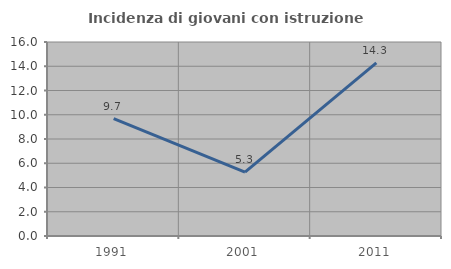
| Category | Incidenza di giovani con istruzione universitaria |
|---|---|
| 1991.0 | 9.677 |
| 2001.0 | 5.263 |
| 2011.0 | 14.286 |